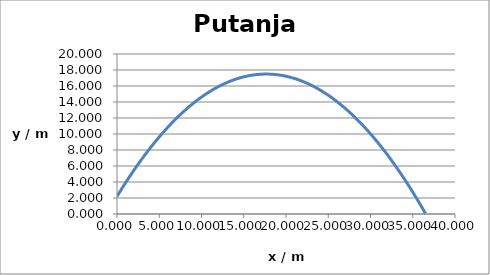
| Category | y / m |
|---|---|
| 0.0 | 2.2 |
| 0.10000000000000002 | 2.373 |
| 0.20000000000000004 | 2.544 |
| 0.30000000000000004 | 2.715 |
| 0.4000000000000001 | 2.885 |
| 0.5000000000000001 | 3.054 |
| 0.6000000000000001 | 3.222 |
| 0.7000000000000001 | 3.388 |
| 0.8 | 3.554 |
| 0.9 | 3.719 |
| 1.0 | 3.883 |
| 1.1 | 4.046 |
| 1.2000000000000002 | 4.208 |
| 1.3000000000000003 | 4.369 |
| 1.4000000000000004 | 4.529 |
| 1.5000000000000004 | 4.688 |
| 1.6000000000000005 | 4.846 |
| 1.7000000000000006 | 5.003 |
| 1.8000000000000007 | 5.159 |
| 1.9000000000000008 | 5.314 |
| 2.000000000000001 | 5.468 |
| 2.100000000000001 | 5.621 |
| 2.200000000000001 | 5.773 |
| 2.300000000000001 | 5.924 |
| 2.4000000000000012 | 6.074 |
| 2.5000000000000013 | 6.224 |
| 2.6000000000000014 | 6.372 |
| 2.7000000000000015 | 6.519 |
| 2.8000000000000016 | 6.665 |
| 2.9000000000000017 | 6.81 |
| 3.0000000000000018 | 6.955 |
| 3.100000000000002 | 7.098 |
| 3.200000000000002 | 7.24 |
| 3.300000000000002 | 7.382 |
| 3.400000000000002 | 7.522 |
| 3.500000000000002 | 7.661 |
| 3.6000000000000023 | 7.8 |
| 3.7000000000000024 | 7.937 |
| 3.8000000000000025 | 8.074 |
| 3.9000000000000026 | 8.209 |
| 4.000000000000003 | 8.343 |
| 4.100000000000002 | 8.477 |
| 4.200000000000002 | 8.609 |
| 4.300000000000002 | 8.741 |
| 4.400000000000001 | 8.871 |
| 4.500000000000001 | 9.001 |
| 4.6000000000000005 | 9.13 |
| 4.7 | 9.257 |
| 4.8 | 9.384 |
| 4.8999999999999995 | 9.509 |
| 4.999999999999999 | 9.634 |
| 5.099999999999999 | 9.758 |
| 5.199999999999998 | 9.88 |
| 5.299999999999998 | 10.002 |
| 5.399999999999998 | 10.123 |
| 5.499999999999997 | 10.243 |
| 5.599999999999997 | 10.361 |
| 5.699999999999997 | 10.479 |
| 5.799999999999996 | 10.596 |
| 5.899999999999996 | 10.712 |
| 5.999999999999996 | 10.827 |
| 6.099999999999995 | 10.94 |
| 6.199999999999995 | 11.053 |
| 6.2999999999999945 | 11.165 |
| 6.399999999999994 | 11.276 |
| 6.499999999999994 | 11.386 |
| 6.599999999999993 | 11.495 |
| 6.699999999999993 | 11.603 |
| 6.799999999999993 | 11.71 |
| 6.899999999999992 | 11.816 |
| 6.999999999999992 | 11.921 |
| 7.099999999999992 | 12.025 |
| 7.199999999999991 | 12.128 |
| 7.299999999999991 | 12.23 |
| 7.399999999999991 | 12.331 |
| 7.49999999999999 | 12.431 |
| 7.59999999999999 | 12.53 |
| 7.6999999999999895 | 12.629 |
| 7.799999999999989 | 12.726 |
| 7.899999999999989 | 12.822 |
| 7.9999999999999885 | 12.917 |
| 8.099999999999989 | 13.011 |
| 8.199999999999989 | 13.105 |
| 8.299999999999988 | 13.197 |
| 8.399999999999988 | 13.288 |
| 8.499999999999988 | 13.379 |
| 8.599999999999987 | 13.468 |
| 8.699999999999987 | 13.556 |
| 8.799999999999986 | 13.644 |
| 8.899999999999986 | 13.73 |
| 8.999999999999986 | 13.815 |
| 9.099999999999985 | 13.9 |
| 9.199999999999985 | 13.983 |
| 9.299999999999985 | 14.066 |
| 9.399999999999984 | 14.147 |
| 9.499999999999984 | 14.228 |
| 9.599999999999984 | 14.307 |
| 9.699999999999983 | 14.386 |
| 9.799999999999983 | 14.463 |
| 9.899999999999983 | 14.54 |
| 9.999999999999982 | 14.616 |
| 10.099999999999982 | 14.69 |
| 10.199999999999982 | 14.764 |
| 10.299999999999981 | 14.836 |
| 10.39999999999998 | 14.908 |
| 10.49999999999998 | 14.979 |
| 10.59999999999998 | 15.048 |
| 10.69999999999998 | 15.117 |
| 10.79999999999998 | 15.185 |
| 10.899999999999979 | 15.252 |
| 10.999999999999979 | 15.318 |
| 11.099999999999978 | 15.382 |
| 11.199999999999978 | 15.446 |
| 11.299999999999978 | 15.509 |
| 11.399999999999977 | 15.571 |
| 11.499999999999977 | 15.632 |
| 11.599999999999977 | 15.692 |
| 11.699999999999976 | 15.751 |
| 11.799999999999976 | 15.808 |
| 11.899999999999975 | 15.865 |
| 11.999999999999975 | 15.921 |
| 12.099999999999975 | 15.976 |
| 12.199999999999974 | 16.03 |
| 12.299999999999974 | 16.083 |
| 12.399999999999974 | 16.136 |
| 12.499999999999973 | 16.187 |
| 12.599999999999973 | 16.237 |
| 12.699999999999973 | 16.286 |
| 12.799999999999972 | 16.334 |
| 12.899999999999972 | 16.381 |
| 12.999999999999972 | 16.427 |
| 13.099999999999971 | 16.472 |
| 13.19999999999997 | 16.517 |
| 13.29999999999997 | 16.56 |
| 13.39999999999997 | 16.602 |
| 13.49999999999997 | 16.643 |
| 13.59999999999997 | 16.684 |
| 13.699999999999969 | 16.723 |
| 13.799999999999969 | 16.761 |
| 13.899999999999968 | 16.799 |
| 13.999999999999968 | 16.835 |
| 14.099999999999968 | 16.87 |
| 14.199999999999967 | 16.905 |
| 14.299999999999967 | 16.938 |
| 14.399999999999967 | 16.971 |
| 14.499999999999966 | 17.002 |
| 14.599999999999966 | 17.032 |
| 14.699999999999966 | 17.062 |
| 14.799999999999965 | 17.09 |
| 14.899999999999965 | 17.118 |
| 14.999999999999964 | 17.145 |
| 15.099999999999964 | 17.17 |
| 15.199999999999964 | 17.195 |
| 15.299999999999963 | 17.218 |
| 15.399999999999963 | 17.241 |
| 15.499999999999963 | 17.263 |
| 15.599999999999962 | 17.283 |
| 15.699999999999962 | 17.303 |
| 15.799999999999962 | 17.322 |
| 15.899999999999961 | 17.339 |
| 15.999999999999961 | 17.356 |
| 16.099999999999962 | 17.372 |
| 16.199999999999964 | 17.387 |
| 16.299999999999965 | 17.4 |
| 16.399999999999967 | 17.413 |
| 16.499999999999968 | 17.425 |
| 16.59999999999997 | 17.436 |
| 16.69999999999997 | 17.446 |
| 16.799999999999972 | 17.455 |
| 16.899999999999974 | 17.462 |
| 16.999999999999975 | 17.469 |
| 17.099999999999977 | 17.475 |
| 17.199999999999978 | 17.48 |
| 17.29999999999998 | 17.484 |
| 17.39999999999998 | 17.487 |
| 17.499999999999982 | 17.489 |
| 17.599999999999984 | 17.49 |
| 17.699999999999985 | 17.49 |
| 17.799999999999986 | 17.49 |
| 17.899999999999988 | 17.488 |
| 17.99999999999999 | 17.485 |
| 18.09999999999999 | 17.481 |
| 18.199999999999992 | 17.476 |
| 18.299999999999994 | 17.47 |
| 18.399999999999995 | 17.463 |
| 18.499999999999996 | 17.456 |
| 18.599999999999998 | 17.447 |
| 18.7 | 17.437 |
| 18.8 | 17.426 |
| 18.900000000000002 | 17.415 |
| 19.000000000000004 | 17.402 |
| 19.100000000000005 | 17.388 |
| 19.200000000000006 | 17.374 |
| 19.300000000000008 | 17.358 |
| 19.40000000000001 | 17.341 |
| 19.50000000000001 | 17.324 |
| 19.600000000000012 | 17.305 |
| 19.700000000000014 | 17.286 |
| 19.800000000000015 | 17.265 |
| 19.900000000000016 | 17.244 |
| 20.000000000000018 | 17.221 |
| 20.10000000000002 | 17.198 |
| 20.20000000000002 | 17.173 |
| 20.300000000000022 | 17.148 |
| 20.400000000000023 | 17.121 |
| 20.500000000000025 | 17.094 |
| 20.600000000000026 | 17.065 |
| 20.700000000000028 | 17.036 |
| 20.80000000000003 | 17.006 |
| 20.90000000000003 | 16.974 |
| 21.000000000000032 | 16.942 |
| 21.100000000000033 | 16.909 |
| 21.200000000000035 | 16.874 |
| 21.300000000000036 | 16.839 |
| 21.400000000000038 | 16.803 |
| 21.50000000000004 | 16.766 |
| 21.60000000000004 | 16.728 |
| 21.700000000000042 | 16.688 |
| 21.800000000000043 | 16.648 |
| 21.900000000000045 | 16.607 |
| 22.000000000000046 | 16.565 |
| 22.100000000000048 | 16.522 |
| 22.20000000000005 | 16.478 |
| 22.30000000000005 | 16.433 |
| 22.400000000000052 | 16.387 |
| 22.500000000000053 | 16.34 |
| 22.600000000000055 | 16.292 |
| 22.700000000000056 | 16.243 |
| 22.800000000000058 | 16.193 |
| 22.90000000000006 | 16.142 |
| 23.00000000000006 | 16.09 |
| 23.100000000000062 | 16.037 |
| 23.200000000000063 | 15.983 |
| 23.300000000000065 | 15.928 |
| 23.400000000000066 | 15.872 |
| 23.500000000000068 | 15.815 |
| 23.60000000000007 | 15.758 |
| 23.70000000000007 | 15.699 |
| 23.80000000000007 | 15.639 |
| 23.900000000000073 | 15.578 |
| 24.000000000000075 | 15.516 |
| 24.100000000000076 | 15.454 |
| 24.200000000000077 | 15.39 |
| 24.30000000000008 | 15.325 |
| 24.40000000000008 | 15.26 |
| 24.50000000000008 | 15.193 |
| 24.600000000000083 | 15.125 |
| 24.700000000000085 | 15.057 |
| 24.800000000000086 | 14.987 |
| 24.900000000000087 | 14.917 |
| 25.00000000000009 | 14.845 |
| 25.10000000000009 | 14.772 |
| 25.20000000000009 | 14.699 |
| 25.300000000000093 | 14.624 |
| 25.400000000000095 | 14.549 |
| 25.500000000000096 | 14.473 |
| 25.600000000000097 | 14.395 |
| 25.7000000000001 | 14.317 |
| 25.8000000000001 | 14.237 |
| 25.9000000000001 | 14.157 |
| 26.000000000000103 | 14.076 |
| 26.100000000000104 | 13.993 |
| 26.200000000000106 | 13.91 |
| 26.300000000000107 | 13.826 |
| 26.40000000000011 | 13.74 |
| 26.50000000000011 | 13.654 |
| 26.60000000000011 | 13.567 |
| 26.700000000000113 | 13.479 |
| 26.800000000000114 | 13.389 |
| 26.900000000000116 | 13.299 |
| 27.000000000000117 | 13.208 |
| 27.10000000000012 | 13.116 |
| 27.20000000000012 | 13.023 |
| 27.30000000000012 | 12.929 |
| 27.400000000000123 | 12.833 |
| 27.500000000000124 | 12.737 |
| 27.600000000000126 | 12.64 |
| 27.700000000000127 | 12.542 |
| 27.80000000000013 | 12.443 |
| 27.90000000000013 | 12.343 |
| 28.00000000000013 | 12.242 |
| 28.100000000000133 | 12.14 |
| 28.200000000000134 | 12.037 |
| 28.300000000000136 | 11.933 |
| 28.400000000000137 | 11.828 |
| 28.50000000000014 | 11.723 |
| 28.60000000000014 | 11.616 |
| 28.70000000000014 | 11.508 |
| 28.800000000000143 | 11.399 |
| 28.900000000000144 | 11.289 |
| 29.000000000000146 | 11.178 |
| 29.100000000000147 | 11.067 |
| 29.20000000000015 | 10.954 |
| 29.30000000000015 | 10.84 |
| 29.40000000000015 | 10.725 |
| 29.500000000000153 | 10.61 |
| 29.600000000000154 | 10.493 |
| 29.700000000000156 | 10.375 |
| 29.800000000000157 | 10.257 |
| 29.90000000000016 | 10.137 |
| 30.00000000000016 | 10.017 |
| 30.10000000000016 | 9.895 |
| 30.200000000000163 | 9.772 |
| 30.300000000000164 | 9.649 |
| 30.400000000000166 | 9.524 |
| 30.500000000000167 | 9.399 |
| 30.60000000000017 | 9.272 |
| 30.70000000000017 | 9.145 |
| 30.80000000000017 | 9.016 |
| 30.900000000000173 | 8.887 |
| 31.000000000000174 | 8.757 |
| 31.100000000000176 | 8.625 |
| 31.200000000000177 | 8.493 |
| 31.30000000000018 | 8.359 |
| 31.40000000000018 | 8.225 |
| 31.50000000000018 | 8.09 |
| 31.600000000000183 | 7.953 |
| 31.700000000000184 | 7.816 |
| 31.800000000000185 | 7.678 |
| 31.900000000000187 | 7.539 |
| 32.000000000000185 | 7.398 |
| 32.100000000000186 | 7.257 |
| 32.20000000000019 | 7.115 |
| 32.30000000000019 | 6.972 |
| 32.40000000000019 | 6.828 |
| 32.50000000000019 | 6.683 |
| 32.60000000000019 | 6.536 |
| 32.700000000000195 | 6.389 |
| 32.800000000000196 | 6.241 |
| 32.9000000000002 | 6.092 |
| 33.0000000000002 | 5.942 |
| 33.1000000000002 | 5.791 |
| 33.2000000000002 | 5.639 |
| 33.3000000000002 | 5.486 |
| 33.400000000000205 | 5.332 |
| 33.500000000000206 | 5.177 |
| 33.60000000000021 | 5.021 |
| 33.70000000000021 | 4.865 |
| 33.80000000000021 | 4.707 |
| 33.90000000000021 | 4.548 |
| 34.00000000000021 | 4.388 |
| 34.100000000000215 | 4.227 |
| 34.200000000000216 | 4.065 |
| 34.30000000000022 | 3.903 |
| 34.40000000000022 | 3.739 |
| 34.50000000000022 | 3.574 |
| 34.60000000000022 | 3.408 |
| 34.70000000000022 | 3.242 |
| 34.800000000000225 | 3.074 |
| 34.900000000000226 | 2.905 |
| 35.00000000000023 | 2.736 |
| 35.10000000000023 | 2.565 |
| 35.20000000000023 | 2.393 |
| 35.30000000000023 | 2.221 |
| 35.40000000000023 | 2.047 |
| 35.500000000000234 | 1.873 |
| 35.600000000000236 | 1.697 |
| 35.70000000000024 | 1.52 |
| 35.80000000000024 | 1.343 |
| 35.90000000000024 | 1.164 |
| 36.00000000000024 | 0.985 |
| 36.10000000000024 | 0.805 |
| 36.200000000000244 | 0.623 |
| 36.300000000000246 | 0.441 |
| 36.40000000000025 | 0.257 |
| 36.50000000000025 | 0.073 |